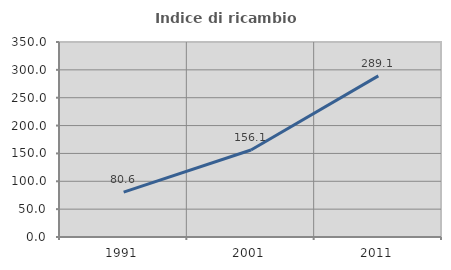
| Category | Indice di ricambio occupazionale  |
|---|---|
| 1991.0 | 80.645 |
| 2001.0 | 156.075 |
| 2011.0 | 289.143 |